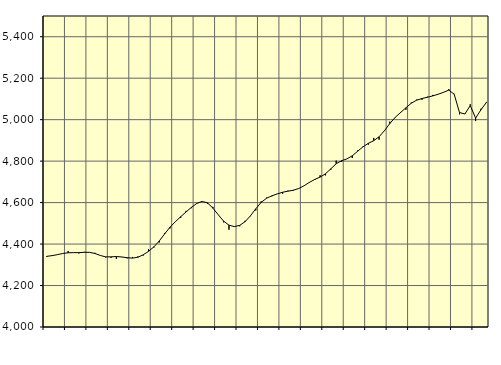
| Category | Piggar | Series 1 |
|---|---|---|
| nan | 4337.9 | 4340.74 |
| 1.0 | 4343.6 | 4344.11 |
| 1.0 | 4349.6 | 4349 |
| 1.0 | 4354.4 | 4354.65 |
| nan | 4366.4 | 4358 |
| 2.0 | 4358 | 4358.6 |
| 2.0 | 4354.8 | 4358.67 |
| 2.0 | 4362.2 | 4360.32 |
| nan | 4359.4 | 4360.01 |
| 3.0 | 4357.8 | 4354.58 |
| 3.0 | 4345.4 | 4345.06 |
| 3.0 | 4335.6 | 4338.28 |
| nan | 4333.7 | 4338.36 |
| 4.0 | 4327.9 | 4339.74 |
| 4.0 | 4337 | 4337.87 |
| 4.0 | 4331.2 | 4334.15 |
| nan | 4337.8 | 4332.28 |
| 5.0 | 4340.1 | 4336.36 |
| 5.0 | 4344.5 | 4348.13 |
| 5.0 | 4375 | 4365.01 |
| nan | 4383 | 4386.64 |
| 6.0 | 4407.7 | 4414.95 |
| 6.0 | 4453.6 | 4448.91 |
| 6.0 | 4475.5 | 4481.27 |
| nan | 4507.2 | 4507.86 |
| 7.0 | 4525.8 | 4532.16 |
| 7.0 | 4560.2 | 4554.89 |
| 7.0 | 4573.2 | 4577.01 |
| nan | 4595.2 | 4596.1 |
| 8.0 | 4606.1 | 4605.71 |
| 8.0 | 4594.6 | 4598.62 |
| 8.0 | 4579.6 | 4573.55 |
| nan | 4541.3 | 4541.46 |
| 9.0 | 4504.9 | 4510.66 |
| 9.0 | 4469.2 | 4491.08 |
| 9.0 | 4485.2 | 4484.22 |
| nan | 4485.8 | 4490.16 |
| 10.0 | 4512.2 | 4507.99 |
| 10.0 | 4534.5 | 4536.05 |
| 10.0 | 4562.1 | 4569.92 |
| nan | 4605.9 | 4600.68 |
| 11.0 | 4623.7 | 4621.2 |
| 11.0 | 4630.2 | 4632.6 |
| 11.0 | 4642.1 | 4641.86 |
| nan | 4642.5 | 4649.99 |
| 12.0 | 4657.7 | 4655 |
| 12.0 | 4657.3 | 4659.69 |
| 12.0 | 4669 | 4667.92 |
| nan | 4680.9 | 4681.07 |
| 13.0 | 4696 | 4697.54 |
| 13.0 | 4708.9 | 4711.82 |
| 13.0 | 4731.9 | 4722.99 |
| nan | 4731.1 | 4738.92 |
| 14.0 | 4758.5 | 4763.01 |
| 14.0 | 4802.8 | 4787.49 |
| 14.0 | 4796.9 | 4802.02 |
| nan | 4810.8 | 4810.77 |
| 15.0 | 4815 | 4825.82 |
| 15.0 | 4851.2 | 4847.55 |
| 15.0 | 4871.1 | 4869.22 |
| nan | 4879.5 | 4886.06 |
| 16.0 | 4912 | 4898.51 |
| 16.0 | 4903.6 | 4917.4 |
| 16.0 | 4945.5 | 4946.81 |
| nan | 4990.4 | 4981.29 |
| 17.0 | 5010.3 | 5011.16 |
| 17.0 | 5037.1 | 5034.23 |
| 17.0 | 5047.8 | 5057.17 |
| nan | 5082.4 | 5079.19 |
| 18.0 | 5096.7 | 5093.83 |
| 18.0 | 5096 | 5101.94 |
| 18.0 | 5110.8 | 5107.92 |
| nan | 5119.4 | 5114.56 |
| 19.0 | 5122.7 | 5122.47 |
| 19.0 | 5132.7 | 5131.83 |
| 19.0 | 5147.6 | 5142.46 |
| nan | 5124.6 | 5123.22 |
| 20.0 | 5025.8 | 5034.51 |
| 20.0 | 5027.9 | 5027.19 |
| 20.0 | 5074.2 | 5068.15 |
| nan | 4993.2 | 5007.53 |
| 21.0 | 5052.8 | 5047.72 |
| 21.0 | 5085.5 | 5082.52 |